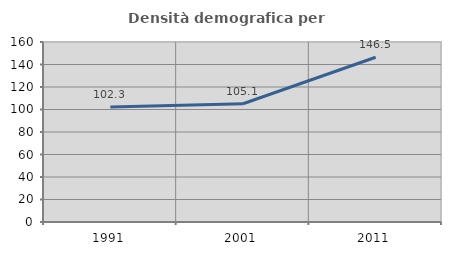
| Category | Densità demografica |
|---|---|
| 1991.0 | 102.271 |
| 2001.0 | 105.078 |
| 2011.0 | 146.45 |